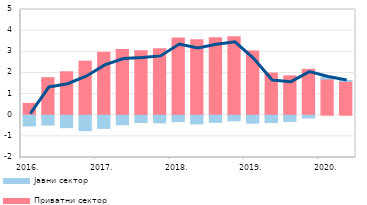
| Category | Приватни сектор | Јавни сектор |
|---|---|---|
| 2016. | 0.559 | -0.507 |
| II | 1.776 | -0.463 |
| III | 2.053 | -0.589 |
| IV | 2.556 | -0.733 |
| 2017. | 2.977 | -0.621 |
| II | 3.109 | -0.452 |
| III | 3.055 | -0.347 |
| IV | 3.145 | -0.363 |
| 2018. | 3.649 | -0.305 |
| II | 3.567 | -0.411 |
| III | 3.668 | -0.334 |
| IV | 3.71 | -0.263 |
| 2019. | 3.039 | -0.375 |
| II | 1.992 | -0.349 |
| III | 1.862 | -0.298 |
| IV | 2.168 | -0.13 |
| 2020. | 1.708 | 0.102 |
| II | 1.599 | 0.045 |